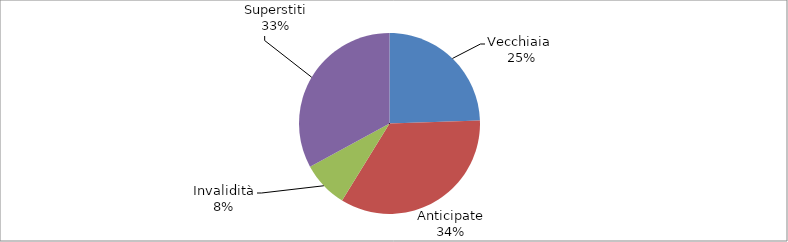
| Category | Series 0 |
|---|---|
| Vecchiaia  | 84570 |
| Anticipate | 118512 |
| Invalidità | 28628 |
| Superstiti | 113765 |